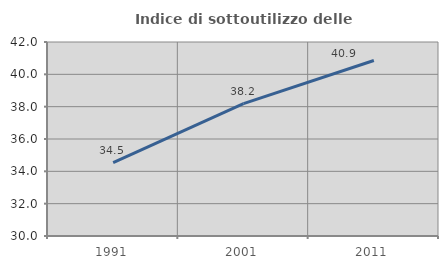
| Category | Indice di sottoutilizzo delle abitazioni  |
|---|---|
| 1991.0 | 34.532 |
| 2001.0 | 38.186 |
| 2011.0 | 40.855 |